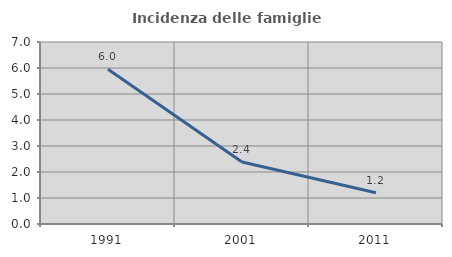
| Category | Incidenza delle famiglie numerose |
|---|---|
| 1991.0 | 5.953 |
| 2001.0 | 2.387 |
| 2011.0 | 1.204 |